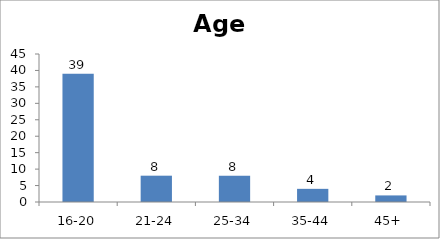
| Category | Age |
|---|---|
| 16-20 | 39 |
| 21-24 | 8 |
| 25-34 | 8 |
| 35-44 | 4 |
| 45+ | 2 |